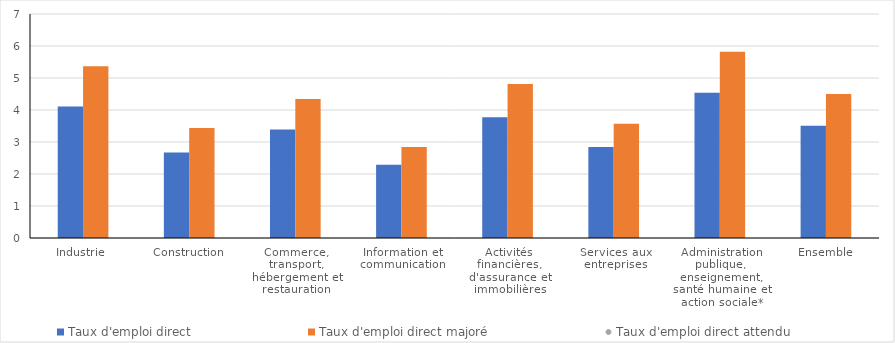
| Category | Taux d'emploi direct | Taux d'emploi direct majoré |
|---|---|---|
| Industrie  | 4.11 | 5.37 |
| Construction | 2.67 | 3.44 |
| Commerce, transport, hébergement et restauration | 3.39 | 4.34 |
| Information et communication | 2.29 | 2.84 |
| Activités financières, d'assurance et immobilières | 3.77 | 4.81 |
| Services aux entreprises | 2.84 | 3.57 |
| Administration publique, enseignement, santé humaine et action sociale* | 4.54 | 5.82 |
| Ensemble | 3.51 | 4.5 |